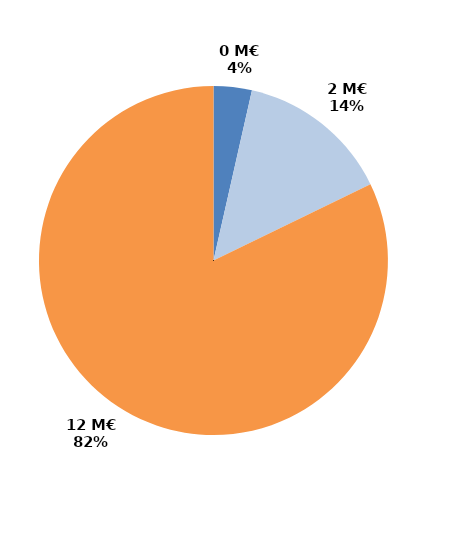
| Category | Series 0 |
|---|---|
| CIF - CPF | 0.498 |
| Période de professionnalisation | 2.004 |
| Plan de formation | 11.557 |
| Autres | 0 |